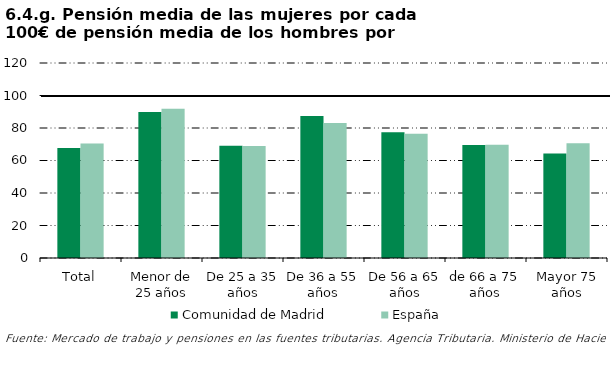
| Category | Comunidad de Madrid | España |
|---|---|---|
| Total | 67.685 | 70.422 |
| Menor de 25 años | 89.876 | 91.915 |
| De 25 a 35 años | 69.054 | 68.874 |
| De 36 a 55 años | 87.43 | 83.003 |
| De 56 a 65 años | 77.428 | 76.491 |
| de 66 a 75 años | 69.508 | 69.718 |
| Mayor 75 años | 64.341 | 70.656 |